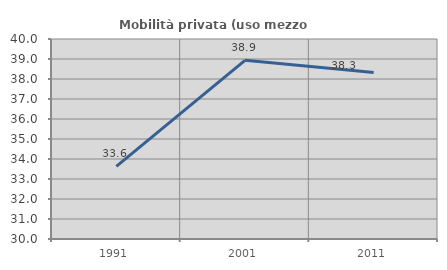
| Category | Mobilità privata (uso mezzo privato) |
|---|---|
| 1991.0 | 33.633 |
| 2001.0 | 38.934 |
| 2011.0 | 38.322 |